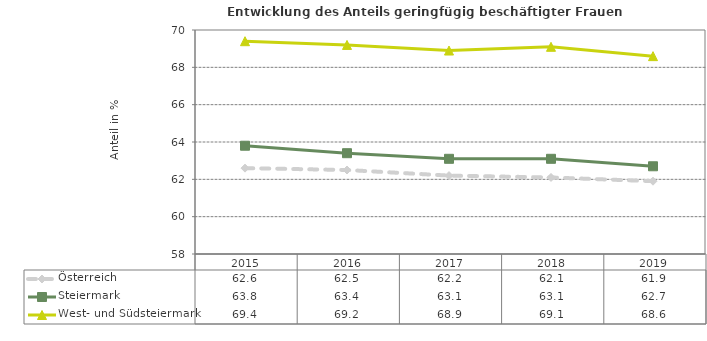
| Category | Österreich | Steiermark | West- und Südsteiermark |
|---|---|---|---|
| 2019.0 | 61.9 | 62.7 | 68.6 |
| 2018.0 | 62.1 | 63.1 | 69.1 |
| 2017.0 | 62.2 | 63.1 | 68.9 |
| 2016.0 | 62.5 | 63.4 | 69.2 |
| 2015.0 | 62.6 | 63.8 | 69.4 |